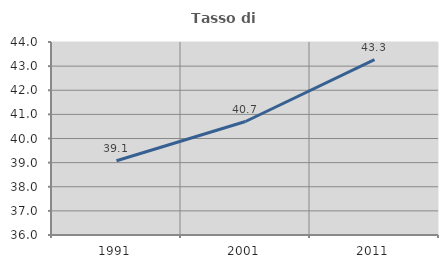
| Category | Tasso di occupazione   |
|---|---|
| 1991.0 | 39.08 |
| 2001.0 | 40.704 |
| 2011.0 | 43.27 |